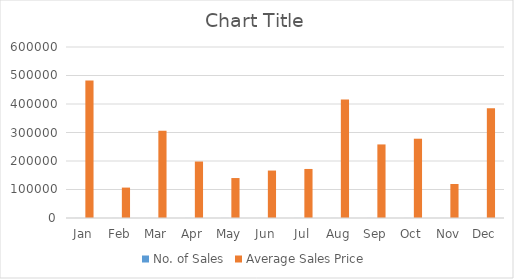
| Category | No. of Sales | Average Sales Price |
|---|---|---|
| Jan | 119 | 482498 |
| Feb | 116 | 106722 |
| Mar | 112 | 306175 |
| Apr | 136 | 198124 |
| May | 140 | 140208 |
| Jun | 113 | 166484 |
| Jul | 133 | 172076 |
| Aug | 117 | 415656 |
| Sep | 150 | 258147 |
| Oct | 113 | 278186 |
| Nov | 119 | 119377 |
| Dec | 125 | 385033 |